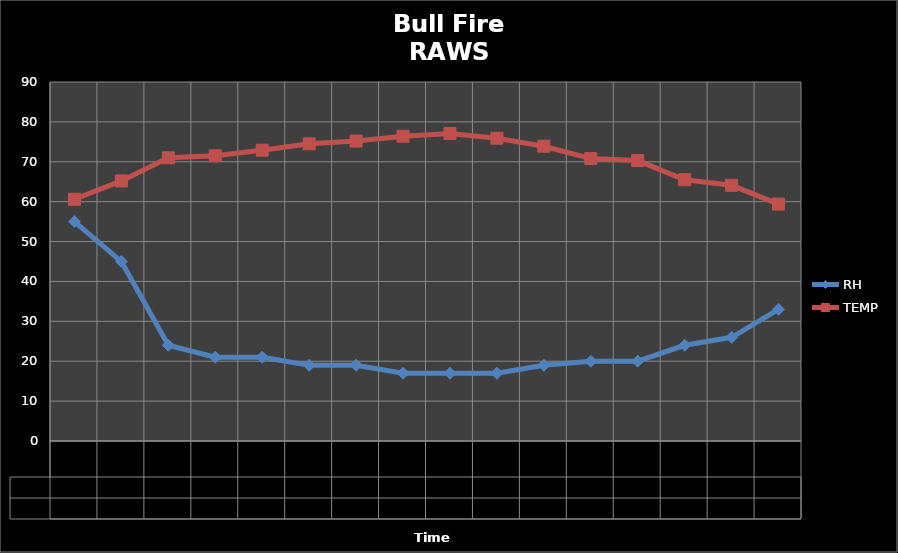
| Category | RH | TEMP |
|---|---|---|
| 2010-08-02 08:23:20 | 55 | 60.6 |
| 2010-08-02 09:23:20 | 45 | 65.2 |
| 2010-08-02 10:23:20 | 24 | 71 |
| 2010-08-02 11:23:20 | 21 | 71.5 |
| 2010-08-02 12:23:20 | 21 | 72.9 |
| 2010-08-02 13:23:20 | 19 | 74.5 |
| 2010-08-02 14:23:20 | 19 | 75.2 |
| 2010-08-02 15:23:20 | 17 | 76.4 |
| 2010-08-02 16:23:20 | 17 | 77.1 |
| 2010-08-02 17:23:20 | 17 | 75.9 |
| 2010-08-02 18:23:20 | 19 | 73.9 |
| 2010-08-02 19:23:20 | 20 | 70.8 |
| 2010-08-02 20:23:20 | 20 | 70.3 |
| 2010-08-02 21:23:20 | 24 | 65.5 |
| 2010-08-02 22:23:20 | 26 | 64.1 |
| 2010-08-02 23:23:20 | 33 | 59.4 |